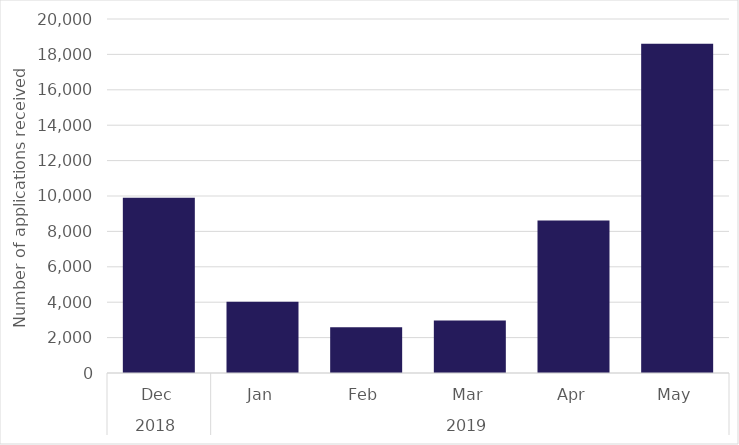
| Category | Series 0 |
|---|---|
| 0 | 9895 |
| 1 | 4025 |
| 2 | 2585 |
| 3 | 2960 |
| 4 | 8620 |
| 5 | 18605 |